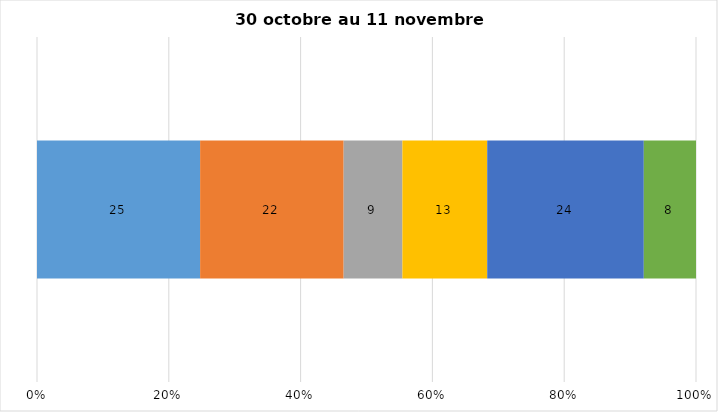
| Category | Plusieurs fois par jour | Une fois par jour | Quelques fois par semaine   | Une fois par semaine ou moins   |  Jamais   |  Je n’utilise pas les médias sociaux |
|---|---|---|---|---|---|---|
| 0 | 25 | 22 | 9 | 13 | 24 | 8 |